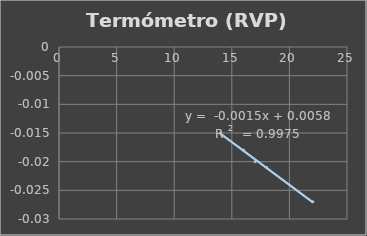
| Category | Termómetro utilizado en el liquido del RVP |
|---|---|
| 14.028 | -0.015 |
| 16.03 | -0.018 |
| 17.028 | -0.02 |
| 18.026 | -0.021 |
| 22.028 | -0.027 |